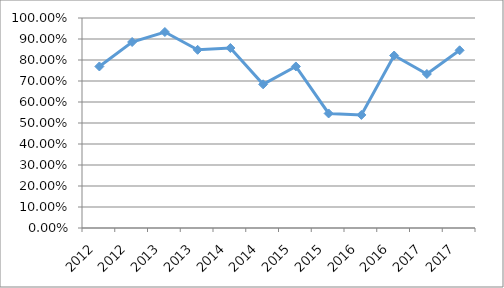
| Category | MATD-I2O43 |
|---|---|
| 2012.0 | 0.769 |
| 2012.0 | 0.886 |
| 2013.0 | 0.933 |
| 2013.0 | 0.848 |
| 2014.0 | 0.857 |
| 2014.0 | 0.684 |
| 2015.0 | 0.769 |
| 2015.0 | 0.545 |
| 2016.0 | 0.538 |
| 2016.0 | 0.821 |
| 2017.0 | 0.733 |
| 2017.0 | 0.846 |